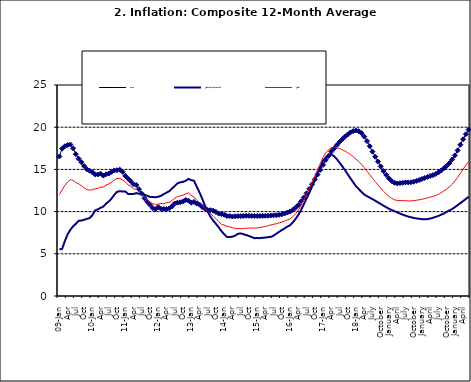
| Category | Food | All Items less Farm Produce | All Items |
|---|---|---|---|
| 09-Jan | 16.536 | 5.519 | 12.032 |
| Feb | 17.454 | 5.591 | 12.567 |
| Mar | 17.742 | 6.51 | 13.101 |
| Apr | 17.89 | 7.302 | 13.51 |
| May | 17.949 | 7.847 | 13.787 |
| June | 17.498 | 8.259 | 13.694 |
| Jul | 16.808 | 8.554 | 13.437 |
| Aug | 16.278 | 8.906 | 13.307 |
| Sep | 15.859 | 8.942 | 13.065 |
| Oct | 15.396 | 9.024 | 12.803 |
| Nov | 15.018 | 9.143 | 12.609 |
| Dec | 14.841 | 9.226 | 12.538 |
| 10-Jan | 14.668 | 9.567 | 12.586 |
| Feb | 14.411 | 10.138 | 12.7 |
| Mar | 14.395 | 10.269 | 12.757 |
| Apr | 14.489 | 10.444 | 12.915 |
| May | 14.266 | 10.597 | 12.893 |
| Jun | 14.424 | 10.948 | 13.132 |
| Jul | 14.514 | 11.193 | 13.284 |
| Aug | 14.706 | 11.549 | 13.5 |
| Sep | 14.872 | 11.997 | 13.764 |
| Oct | 14.906 | 12.345 | 13.908 |
| Nov | 14.967 | 12.423 | 13.928 |
| Dec | 14.723 | 12.383 | 13.74 |
| 11-Jan | 14.233 | 12.385 | 13.542 |
| Feb | 13.903 | 12.099 | 13.161 |
| Mar | 13.606 | 12.077 | 13.001 |
| Apr | 13.227 | 12.088 | 12.694 |
| May | 13.152 | 12.198 | 12.648 |
| Jun | 12.654 | 12.1 | 12.321 |
| Jul | 12.118 | 12.109 | 12.009 |
| Aug | 11.575 | 11.98 | 11.635 |
| Sep | 11.155 | 11.877 | 11.363 |
| Oct | 10.797 | 11.746 | 11.13 |
| Nov | 10.422 | 11.721 | 10.952 |
| Dec | 10.298 | 11.706 | 10.826 |
| 12-Jan | 10.538 | 11.765 | 10.886 |
| 12-Feb | 10.336 | 11.872 | 10.955 |
| 12-Mar | 10.325 | 12.075 | 10.914 |
| Apr | 10.304 | 12.242 | 11.054 |
| May | 10.387 | 12.419 | 11.096 |
| Jun | 10.617 | 12.732 | 11.32 |
| Jul | 10.963 | 13.032 | 11.599 |
| Aug | 11.056 | 13.349 | 11.791 |
| Sep | 11.104 | 13.467 | 11.859 |
| Oct | 11.216 | 13.525 | 11.948 |
| Nov | 11.372 | 13.649 | 12.091 |
| Dec | 11.296 | 13.873 | 12.224 |
| 13-Jan | 11.055 | 13.737 | 11.908 |
| Feb | 11.153 | 13.657 | 11.703 |
| Mar | 10.951 | 12.963 | 11.394 |
| Apr | 10.844 | 12.281 | 11.072 |
| May | 10.548 | 11.531 | 10.761 |
| Jun | 10.352 | 10.704 | 10.383 |
| Jul | 10.186 | 10.005 | 10.047 |
| Aug | 10.168 | 9.4 | 9.761 |
| Sep | 10.105 | 8.939 | 9.486 |
| Oct | 9.955 | 8.553 | 9.167 |
| Nov | 9.774 | 8.136 | 8.815 |
| Dec | 9.695 | 7.691 | 8.496 |
| 14-Jan | 9.626 | 7.317 | 8.408 |
| Feb | 9.484 | 7.005 | 8.257 |
| Mar | 9.464 | 6.976 | 8.19 |
| Apr | 9.416 | 7.03 | 8.092 |
| May | 9.448 | 7.151 | 8.012 |
| Jun | 9.464 | 7.369 | 7.998 |
| Jul | 9.459 | 7.411 | 7.968 |
| Aug | 9.481 | 7.325 | 7.996 |
| Sep | 9.501 | 7.228 | 8.027 |
| Oct | 9.508 | 7.116 | 8.047 |
| Nov | 9.492 | 6.991 | 8.046 |
| Dec | 9.481 | 6.854 | 8.047 |
| 15-Jan | 9.475 | 6.865 | 8.063 |
| Feb | 9.486 | 6.852 | 8.117 |
| Mar | 9.495 | 6.905 | 8.176 |
| Apr | 9.501 | 6.922 | 8.243 |
| May | 9.51 | 6.975 | 8.331 |
| Jun | 9.535 | 7.006 | 8.417 |
| Jul | 9.552 | 7.154 | 8.497 |
| Aug | 9.571 | 7.384 | 8.566 |
| Sep | 9.614 | 7.605 | 8.658 |
| Oct | 9.68 | 7.812 | 8.76 |
| Nov | 9.778 | 8.016 | 8.879 |
| Dec | 9.898 | 8.222 | 9.009 |
| 16-Jan | 10.017 | 8.391 | 9.13 |
| Feb | 10.184 | 8.732 | 9.386 |
| Mar | 10.471 | 9.132 | 9.751 |
| Apr | 10.786 | 9.614 | 10.182 |
| May | 11.221 | 10.196 | 10.746 |
| Jun | 11.672 | 10.864 | 11.372 |
| Jul | 12.162 | 11.553 | 12.045 |
| Aug | 12.696 | 12.247 | 12.744 |
| Sep | 13.238 | 12.98 | 13.454 |
| Oct | 13.817 | 13.757 | 14.206 |
| Nov | 14.386 | 14.542 | 14.958 |
| Dec | 14.946 | 15.307 | 15.697 |
| 17-Jan | 15.536 | 16.042 | 16.441 |
| Feb | 16.127 | 16.436 | 16.958 |
| Mar | 16.598 | 16.682 | 17.315 |
| Apr | 17.106 | 16.772 | 17.591 |
| May | 17.477 | 16.567 | 17.628 |
| Jun | 17.868 | 16.219 | 17.578 |
| Jul | 18.247 | 15.798 | 17.475 |
| Aug | 18.569 | 15.372 | 17.331 |
| Sep | 18.876 | 14.903 | 17.17 |
| Oct | 19.14 | 14.415 | 16.968 |
| Nov | 19.392 | 13.93 | 16.76 |
| Dec | 19.546 | 13.458 | 16.502 |
| 18-Jan | 19.621 | 13.01 | 16.215 |
| Feb | 19.521 | 12.668 | 15.93 |
| Mar | 19.294 | 12.33 | 15.599 |
| Apr | 18.886 | 12.021 | 15.196 |
| May | 18.359 | 11.828 | 14.793 |
| June | 17.745 | 11.651 | 14.371 |
| July | 17.102 | 11.478 | 13.95 |
| August | 16.501 | 11.285 | 13.546 |
| September | 15.923 | 11.092 | 13.157 |
| October | 15.355 | 10.903 | 12.777 |
| November | 14.802 | 10.703 | 12.406 |
| December | 14.348 | 10.514 | 12.095 |
| January | 13.934 | 10.339 | 11.801 |
| February | 13.62 | 10.185 | 11.564 |
| March | 13.42 | 10.044 | 11.401 |
| April | 13.339 | 9.909 | 11.314 |
| May | 13.371 | 9.77 | 11.299 |
| June | 13.418 | 9.64 | 11.297 |
| July | 13.46 | 9.524 | 11.291 |
| August | 13.458 | 9.411 | 11.271 |
| September | 13.474 | 9.337 | 11.268 |
| October | 13.544 | 9.253 | 11.298 |
| November | 13.646 | 9.189 | 11.348 |
| December | 13.743 | 9.155 | 11.396 |
| January | 13.859 | 9.112 | 11.462 |
| February | 13.98 | 9.086 | 11.539 |
| March | 14.109 | 9.112 | 11.624 |
| April | 14.221 | 9.174 | 11.706 |
| May | 14.325 | 9.267 | 11.791 |
| June | 14.46 | 9.375 | 11.904 |
| July | 14.634 | 9.484 | 12.049 |
| August | 14.869 | 9.638 | 12.233 |
| September | 15.135 | 9.775 | 12.44 |
| October | 15.416 | 9.965 | 12.664 |
| November | 15.746 | 10.136 | 12.923 |
| December | 16.169 | 10.308 | 13.246 |
| January | 16.662 | 10.519 | 13.616 |
| February | 17.251 | 10.767 | 14.053 |
| March | 17.929 | 11.015 | 14.554 |
| April | 18.576 | 11.247 | 15.039 |
| May | 19.176 | 11.502 | 15.499 |
| June | 19.721 | 11.75 | 15.927 |